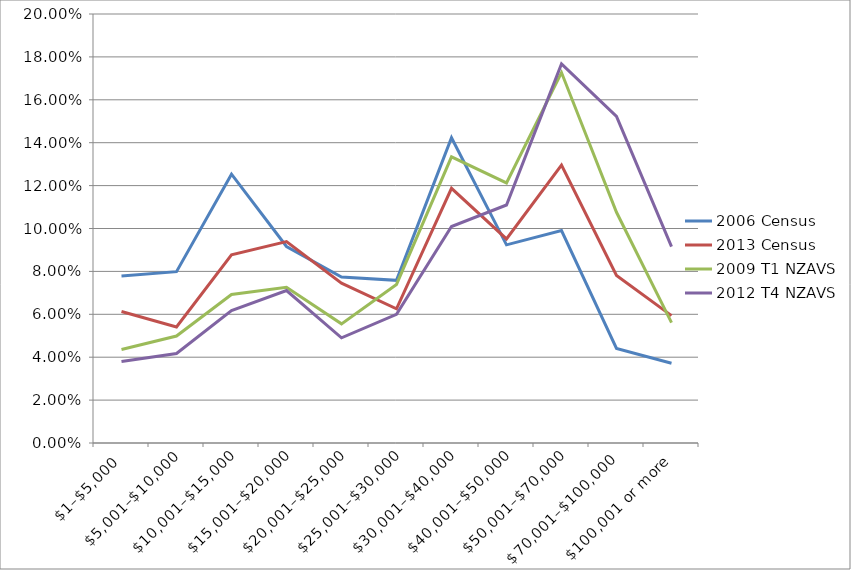
| Category | 2006 Census | 2013 Census | 2009 T1 NZAVS | 2012 T4 NZAVS |
|---|---|---|---|---|
| $1–$5,000 | 0.078 | 0.061 | 0.044 | 0.038 |
| $5,001–$10,000 | 0.08 | 0.054 | 0.05 | 0.042 |
| $10,001–$15,000 | 0.125 | 0.088 | 0.069 | 0.062 |
| $15,001–$20,000 | 0.092 | 0.094 | 0.073 | 0.071 |
| $20,001–$25,000 | 0.077 | 0.074 | 0.056 | 0.049 |
| $25,001–$30,000 | 0.076 | 0.063 | 0.074 | 0.06 |
| $30,001–$40,000 | 0.142 | 0.119 | 0.133 | 0.101 |
| $40,001–$50,000 | 0.092 | 0.095 | 0.121 | 0.111 |
| $50,001–$70,000 | 0.099 | 0.13 | 0.173 | 0.177 |
| $70,001–$100,000 | 0.044 | 0.078 | 0.108 | 0.152 |
| $100,001 or more | 0.037 | 0.059 | 0.056 | 0.092 |